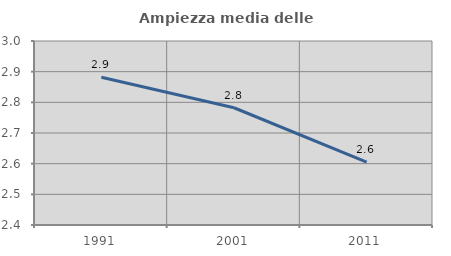
| Category | Ampiezza media delle famiglie |
|---|---|
| 1991.0 | 2.882 |
| 2001.0 | 2.782 |
| 2011.0 | 2.605 |